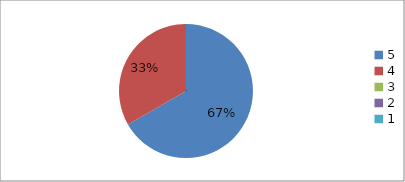
| Category | Series 0 | Series 1 |
|---|---|---|
| 5.0 | 66.7 | 66.7 |
| 4.0 | 33.3 | 33.3 |
| 3.0 | 0 | 0 |
| 2.0 | 0 | 0 |
| 1.0 | 0 | 0 |